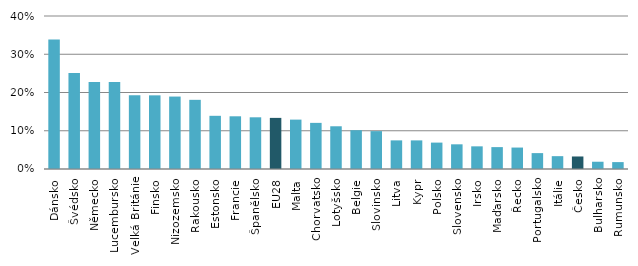
| Category | Value |
|---|---|
| Dánsko | 0.339 |
| Švédsko | 0.251 |
| Německo | 0.228 |
| Lucembursko | 0.227 |
| Velká Británie | 0.193 |
| Finsko | 0.193 |
| Nizozemsko | 0.189 |
| Rakousko | 0.181 |
| Estonsko | 0.139 |
| Francie | 0.138 |
| Španělsko | 0.135 |
| EU28 | 0.134 |
| Malta | 0.129 |
| Chorvatsko | 0.121 |
| Lotyšsko | 0.112 |
| Belgie | 0.101 |
| Slovinsko | 0.099 |
| Litva | 0.075 |
| Kypr | 0.075 |
| Polsko | 0.069 |
| Slovensko | 0.065 |
| Irsko | 0.059 |
| Maďarsko | 0.057 |
| Řecko | 0.056 |
| Portugalsko | 0.042 |
| Itálie | 0.034 |
| Česko | 0.033 |
| Bulharsko | 0.019 |
| Rumunsko | 0.018 |